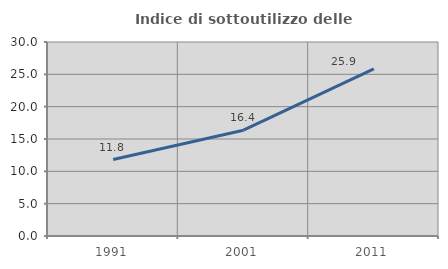
| Category | Indice di sottoutilizzo delle abitazioni  |
|---|---|
| 1991.0 | 11.818 |
| 2001.0 | 16.361 |
| 2011.0 | 25.857 |